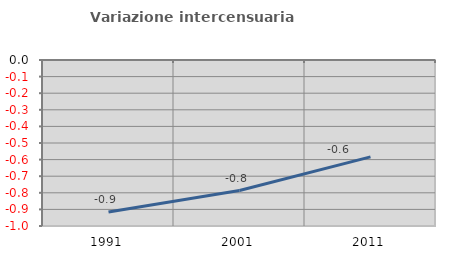
| Category | Variazione intercensuaria annua |
|---|---|
| 1991.0 | -0.916 |
| 2001.0 | -0.786 |
| 2011.0 | -0.584 |